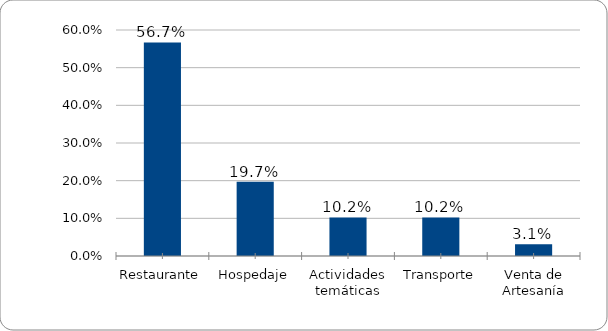
| Category | Series 0 |
|---|---|
| Restaurante | 0.567 |
| Hospedaje | 0.197 |
| Actividades temáticas | 0.102 |
| Transporte | 0.102 |
| Venta de Artesanía | 0.031 |